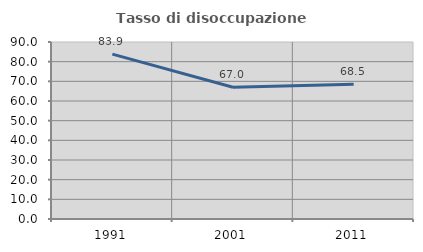
| Category | Tasso di disoccupazione giovanile  |
|---|---|
| 1991.0 | 83.852 |
| 2001.0 | 66.977 |
| 2011.0 | 68.502 |